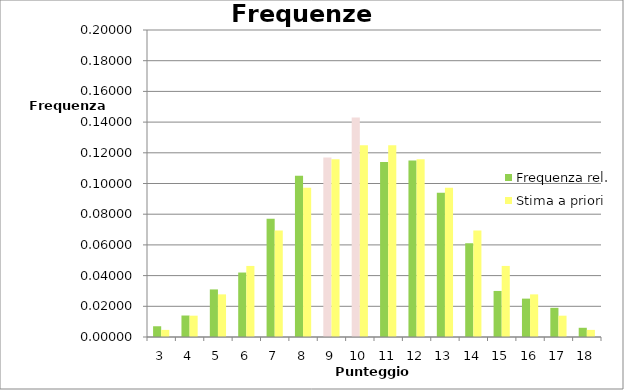
| Category | Frequenza rel. | Stima a priori |
|---|---|---|
| 3.0 | 0.007 | 0.005 |
| 4.0 | 0.014 | 0.014 |
| 5.0 | 0.031 | 0.028 |
| 6.0 | 0.042 | 0.046 |
| 7.0 | 0.077 | 0.069 |
| 8.0 | 0.105 | 0.097 |
| 9.0 | 0.117 | 0.116 |
| 10.0 | 0.143 | 0.125 |
| 11.0 | 0.114 | 0.125 |
| 12.0 | 0.115 | 0.116 |
| 13.0 | 0.094 | 0.097 |
| 14.0 | 0.061 | 0.069 |
| 15.0 | 0.03 | 0.046 |
| 16.0 | 0.025 | 0.028 |
| 17.0 | 0.019 | 0.014 |
| 18.0 | 0.006 | 0.005 |